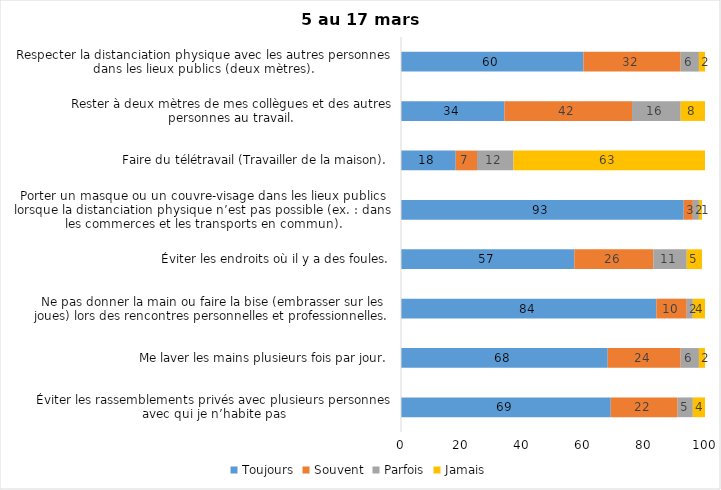
| Category | Toujours | Souvent | Parfois | Jamais |
|---|---|---|---|---|
| Éviter les rassemblements privés avec plusieurs personnes avec qui je n’habite pas | 69 | 22 | 5 | 4 |
| Me laver les mains plusieurs fois par jour. | 68 | 24 | 6 | 2 |
| Ne pas donner la main ou faire la bise (embrasser sur les joues) lors des rencontres personnelles et professionnelles. | 84 | 10 | 2 | 4 |
| Éviter les endroits où il y a des foules. | 57 | 26 | 11 | 5 |
| Porter un masque ou un couvre-visage dans les lieux publics lorsque la distanciation physique n’est pas possible (ex. : dans les commerces et les transports en commun). | 93 | 3 | 2 | 1 |
| Faire du télétravail (Travailler de la maison). | 18 | 7 | 12 | 63 |
| Rester à deux mètres de mes collègues et des autres personnes au travail. | 34 | 42 | 16 | 8 |
| Respecter la distanciation physique avec les autres personnes dans les lieux publics (deux mètres). | 60 | 32 | 6 | 2 |